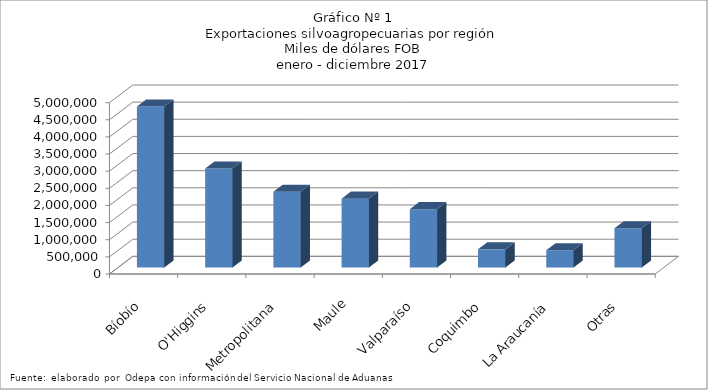
| Category | Series 0 |
|---|---|
| Bíobío | 4697901.906 |
| O'Higgins | 2891018.262 |
| Metropolitana | 2212804.1 |
| Maule | 2010699.435 |
| Valparaíso | 1702604.495 |
| Coquimbo | 530407.463 |
| La Araucanía | 503455.809 |
| Otras | 1147904.416 |